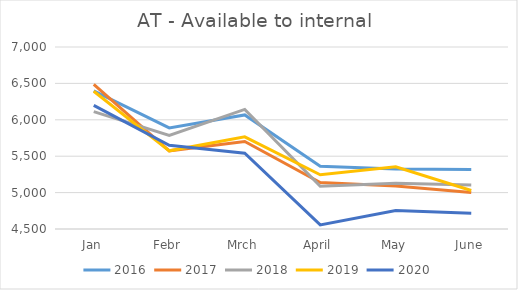
| Category | 2016 | 2017 | 2018 | 2019 | 2020 |
|---|---|---|---|---|---|
| Jan | 6397 | 6487.446 | 6112.774 | 6392.332 | 6198.976 |
| Febr | 5888 | 5573.772 | 5784.098 | 5573.692 | 5649.613 |
| Mrch | 6067 | 5701.377 | 6142.653 | 5765.677 | 5541.86 |
| April | 5361 | 5137.276 | 5088.123 | 5245.656 | 4555.8 |
| May | 5324 | 5091.377 | 5128.399 | 5355.76 | 4754.406 |
| June | 5317 | 5001.528 | 5104.72 | 5028.373 | 4717.345 |